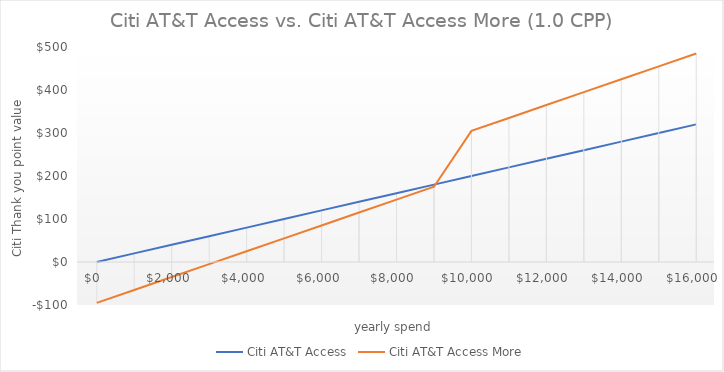
| Category | Citi AT&T Access | Citi AT&T Access More |
|---|---|---|
| 0.0 | 0 | -95 |
| 1000.0 | 20 | -65 |
| 2000.0 | 40 | -35 |
| 3000.0 | 60 | -5 |
| 4000.0 | 80 | 25 |
| 5000.0 | 100 | 55 |
| 6000.0 | 120 | 85 |
| 7000.0 | 140 | 115 |
| 8000.0 | 160 | 145 |
| 9000.0 | 180 | 175 |
| 10000.0 | 200 | 305 |
| 11000.0 | 220 | 335 |
| 12000.0 | 240 | 365 |
| 13000.0 | 260 | 395 |
| 14000.0 | 280 | 425 |
| 15000.0 | 300 | 455 |
| 16000.0 | 320 | 485 |